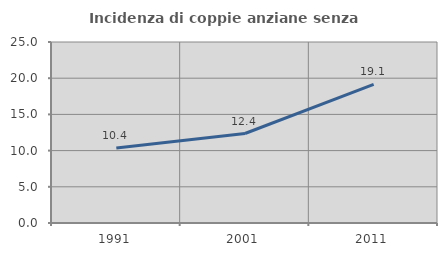
| Category | Incidenza di coppie anziane senza figli  |
|---|---|
| 1991.0 | 10.373 |
| 2001.0 | 12.36 |
| 2011.0 | 19.134 |